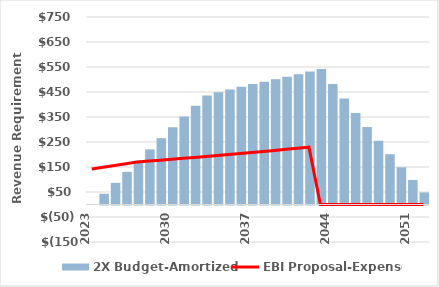
| Category | 2X Budget-Amortized |
|---|---|
| 2023.0 | 0 |
| 2024.0 | 43.024 |
| 2025.0 | 86.575 |
| 2026.0 | 130.683 |
| 2027.0 | 175.377 |
| 2028.0 | 220.688 |
| 2029.0 | 265.285 |
| 2030.0 | 309.152 |
| 2031.0 | 352.276 |
| 2032.0 | 394.64 |
| 2033.0 | 436.231 |
| 2034.0 | 448.58 |
| 2035.0 | 460.268 |
| 2036.0 | 471.284 |
| 2037.0 | 481.614 |
| 2038.0 | 491.247 |
| 2039.0 | 501.072 |
| 2040.0 | 511.093 |
| 2041.0 | 521.315 |
| 2042.0 | 531.741 |
| 2043.0 | 542.376 |
| 2044.0 | 482.447 |
| 2045.0 | 423.716 |
| 2046.0 | 366.208 |
| 2047.0 | 309.947 |
| 2048.0 | 254.958 |
| 2049.0 | 201.266 |
| 2050.0 | 148.898 |
| 2051.0 | 97.879 |
| 2052.0 | 48.237 |